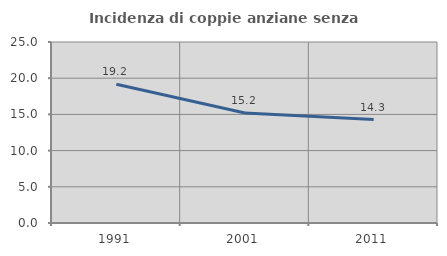
| Category | Incidenza di coppie anziane senza figli  |
|---|---|
| 1991.0 | 19.162 |
| 2001.0 | 15.19 |
| 2011.0 | 14.286 |